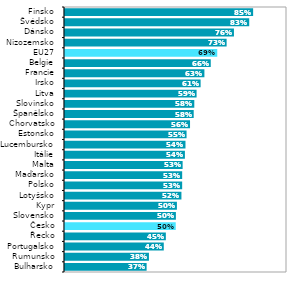
| Category | Series 1 |
|---|---|
| Bulharsko | 0.368 |
| Rumunsko | 0.378 |
| Portugalsko | 0.445 |
| Řecko | 0.454 |
| Česko | 0.499 |
| Slovensko | 0.5 |
| Kypr | 0.504 |
| Lotyšsko | 0.524 |
| Polsko | 0.528 |
| Maďarsko | 0.528 |
| Malta | 0.53 |
| Itálie | 0.54 |
| Lucembursko | 0.543 |
| Estonsko | 0.548 |
| Chorvatsko | 0.563 |
| Španělsko | 0.58 |
| Slovinsko | 0.582 |
| Litva | 0.593 |
| Irsko | 0.611 |
| Francie | 0.628 |
| Belgie | 0.657 |
| EU27 | 0.686 |
| Nizozemsko | 0.728 |
| Dánsko | 0.761 |
| Švédsko | 0.83 |
| Finsko | 0.847 |